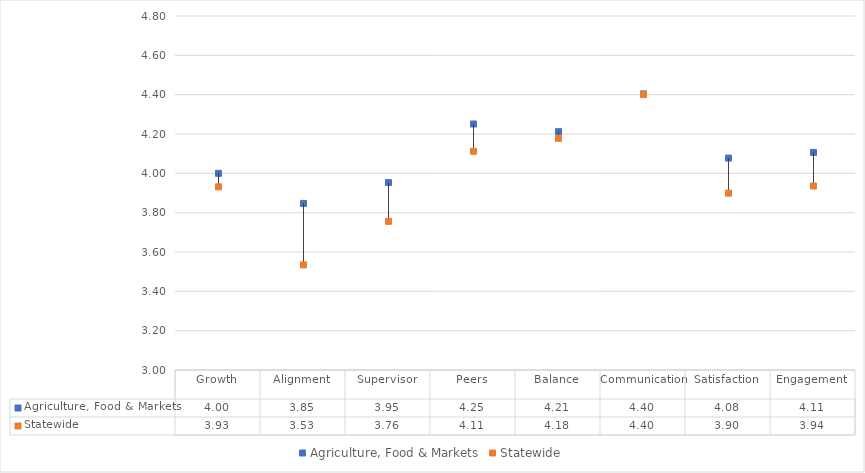
| Category | Agriculture, Food & Markets | Statewide |
|---|---|---|
| Growth | 4 | 3.931 |
| Alignment | 3.847 | 3.534 |
| Supervisor | 3.953 | 3.756 |
| Peers | 4.251 | 4.112 |
| Balance | 4.212 | 4.178 |
| Communication | 4.404 | 4.4 |
| Satisfaction | 4.078 | 3.899 |
| Engagement | 4.106 | 3.936 |